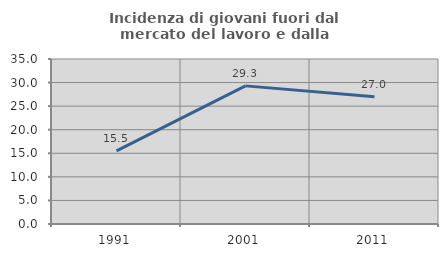
| Category | Incidenza di giovani fuori dal mercato del lavoro e dalla formazione  |
|---|---|
| 1991.0 | 15.521 |
| 2001.0 | 29.298 |
| 2011.0 | 26.997 |